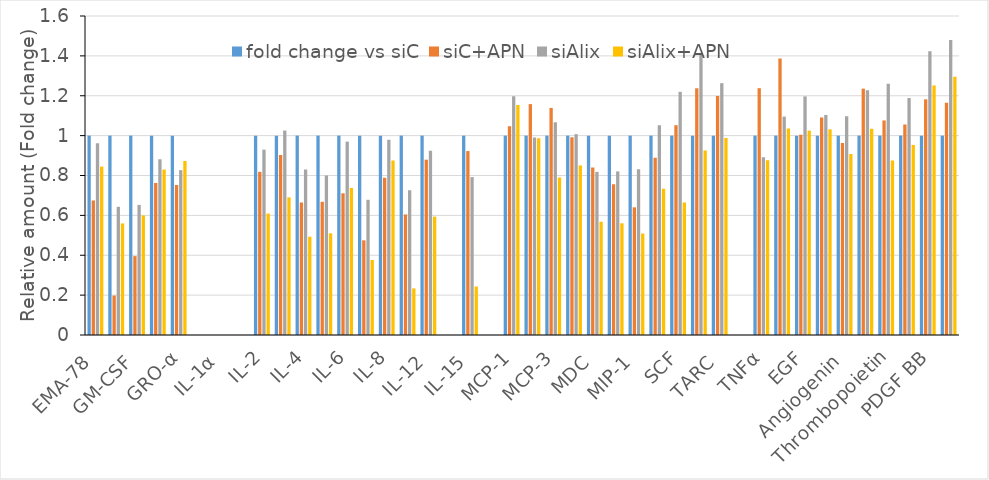
| Category | fold change vs siC | siC+APN | siAlix | siAlix+APN |
|---|---|---|---|---|
| EMA-78 | 1 | 0.675 | 0.962 | 0.845 |
| GCSF | 1 | 0.198 | 0.643 | 0.56 |
| GM-CSF | 1 | 0.396 | 0.653 | 0.6 |
| GRO | 1 | 0.762 | 0.881 | 0.83 |
| GRO-α | 1 | 0.752 | 0.827 | 0.873 |
| I-309 | 0 | 0 | 0 | 0 |
| IL-1α | 0 | 0 | 0 | 0 |
| IL-1β | 0 | 0 | 0 | 0 |
| IL-2 | 1 | 0.818 | 0.93 | 0.609 |
| IL-3 | 1 | 0.902 | 1.025 | 0.69 |
| IL-4 | 1 | 0.664 | 0.83 | 0.493 |
| IL-5 | 1 | 0.668 | 0.8 | 0.51 |
| IL-6 | 1 | 0.711 | 0.97 | 0.737 |
| IL-7 | 1 | 0.475 | 0.678 | 0.376 |
| IL-8 | 1 | 0.789 | 0.979 | 0.875 |
| IL-10 | 1 | 0.605 | 0.726 | 0.234 |
| IL-12 | 1 | 0.879 | 0.925 | 0.594 |
| IL-13 | 0 | 0 | 0 | 0 |
| IL-15 | 1 | 0.923 | 0.792 | 0.243 |
| IFNγ | 0 | 0 | 0 | 0 |
| MCP-1 | 1 | 1.047 | 1.198 | 1.154 |
| MCP-2 | 1 | 1.158 | 0.991 | 0.987 |
| MCP-3 | 1 | 1.139 | 1.067 | 0.79 |
| MCSF | 1 | 0.992 | 1.007 | 0.851 |
| MDC | 1 | 0.84 | 0.818 | 0.568 |
| MIG | 1 | 0.756 | 0.821 | 0.56 |
| MIP-1 | 1 | 0.64 | 0.832 | 0.509 |
| RANTES | 1 | 0.889 | 1.052 | 0.733 |
| SCF | 1 | 1.052 | 1.22 | 0.664 |
| SDF-1 | 1 | 1.237 | 1.406 | 0.926 |
| TARC | 1 | 1.199 | 1.263 | 0.988 |
| TGFβ1 | 0 | 0 | 0 | 0 |
| TNFα | 1 | 1.238 | 0.892 | 0.876 |
| TNFβ | 1 | 1.387 | 1.095 | 1.036 |
| EGF | 1 | 1.004 | 1.197 | 1.025 |
| IGF-1 | 1 | 1.09 | 1.104 | 1.031 |
| Angiogenin | 1 | 0.963 | 1.097 | 0.908 |
| Oncostatin M | 1 | 1.236 | 1.228 | 1.035 |
| Thrombopoietin | 1 | 1.076 | 1.26 | 0.875 |
| VEGF | 1 | 1.056 | 1.189 | 0.953 |
| PDGF BB | 1 | 1.182 | 1.423 | 1.252 |
| Leptin | 1 | 1.165 | 1.48 | 1.295 |